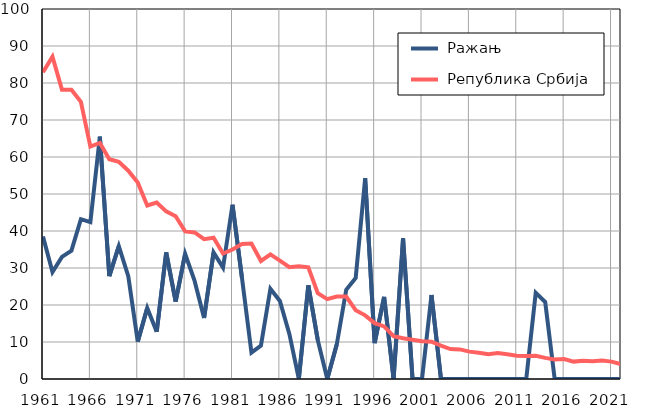
| Category |  Ражањ |  Република Србија |
|---|---|---|
| 1961.0 | 38.5 | 82.9 |
| 1962.0 | 28.9 | 87.1 |
| 1963.0 | 33 | 78.2 |
| 1964.0 | 34.7 | 78.2 |
| 1965.0 | 43.2 | 74.9 |
| 1966.0 | 42.4 | 62.8 |
| 1967.0 | 65.5 | 63.8 |
| 1968.0 | 27.8 | 59.4 |
| 1969.0 | 35.9 | 58.7 |
| 1970.0 | 27.8 | 56.3 |
| 1971.0 | 10.1 | 53.1 |
| 1972.0 | 19.2 | 46.9 |
| 1973.0 | 12.8 | 47.7 |
| 1974.0 | 34.2 | 45.3 |
| 1975.0 | 20.9 | 44 |
| 1976.0 | 33.8 | 39.9 |
| 1977.0 | 26.5 | 39.6 |
| 1978.0 | 16.5 | 37.8 |
| 1979.0 | 34.2 | 38.2 |
| 1980.0 | 30.1 | 33.9 |
| 1981.0 | 47.1 | 35 |
| 1982.0 | 27.3 | 36.5 |
| 1983.0 | 7.1 | 36.6 |
| 1984.0 | 9 | 31.9 |
| 1985.0 | 24.4 | 33.7 |
| 1986.0 | 21.1 | 32 |
| 1987.0 | 12.2 | 30.2 |
| 1988.0 | 0 | 30.5 |
| 1989.0 | 25.3 | 30.2 |
| 1990.0 | 10.5 | 23.2 |
| 1991.0 | 0 | 21.6 |
| 1992.0 | 9.3 | 22.3 |
| 1993.0 | 24.1 | 22.3 |
| 1994.0 | 27.3 | 18.6 |
| 1995.0 | 54.3 | 17.2 |
| 1996.0 | 9.7 | 15.1 |
| 1997.0 | 22.2 | 14.2 |
| 1998.0 | 0 | 11.6 |
| 1999.0 | 38 | 11 |
| 2000.0 | 0 | 10.6 |
| 2001.0 | 0 | 10.2 |
| 2002.0 | 22.7 | 10.1 |
| 2003.0 | 0 | 9 |
| 2004.0 | 0 | 8.1 |
| 2005.0 | 0 | 8 |
| 2006.0 | 0 | 7.4 |
| 2007.0 | 0 | 7.1 |
| 2008.0 | 0 | 6.7 |
| 2009.0 | 0 | 7 |
| 2010.0 | 0 | 6.7 |
| 2011.0 | 0 | 6.3 |
| 2012.0 | 0 | 6.2 |
| 2013.0 | 23.3 | 6.3 |
| 2014.0 | 20.8 | 5.7 |
| 2015.0 | 0 | 5.3 |
| 2016.0 | 0 | 5.4 |
| 2017.0 | 0 | 4.7 |
| 2018.0 | 0 | 4.9 |
| 2019.0 | 0 | 4.8 |
| 2020.0 | 0 | 5 |
| 2021.0 | 0 | 4.7 |
| 2022.0 | 0 | 4 |